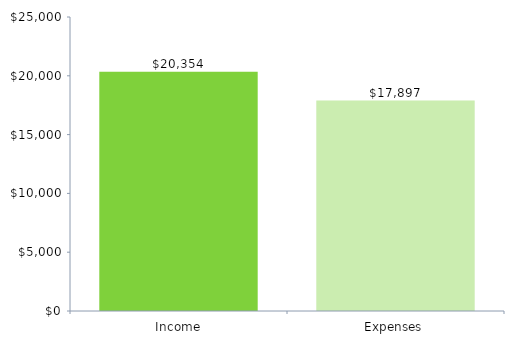
| Category | ChartData |
|---|---|
| 0 | 20354 |
| 1 | 17897 |